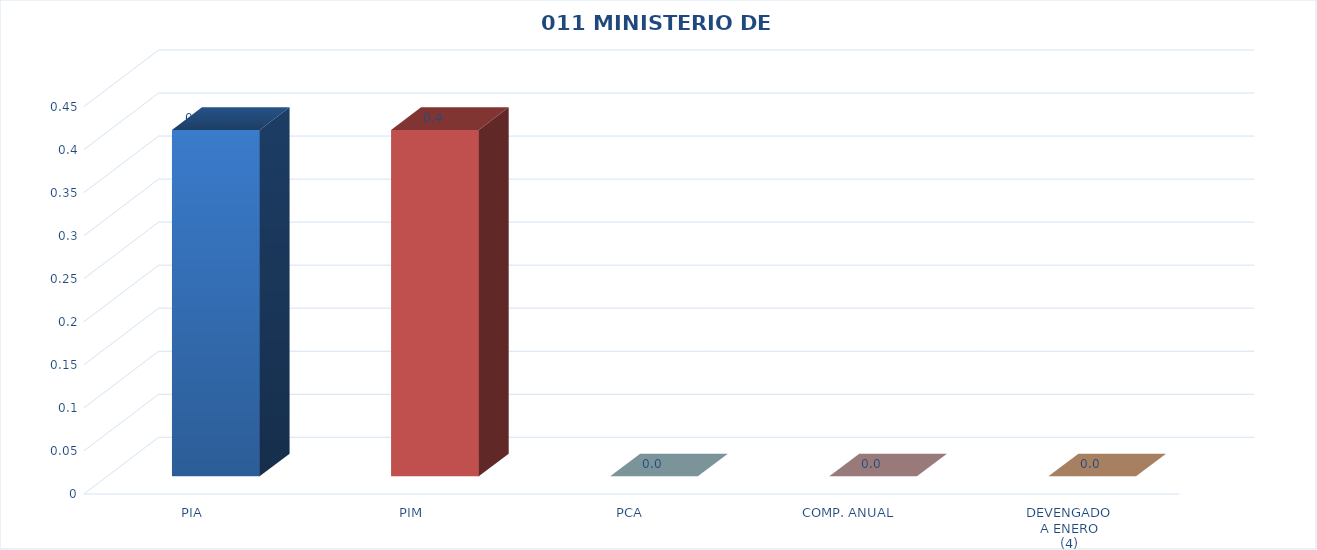
| Category | 011 MINISTERIO DE SALUD |
|---|---|
| PIA | 0.402 |
| PIM | 0.402 |
| PCA | 0 |
| COMP. ANUAL | 0 |
| DEVENGADO
A ENERO
(4) | 0 |